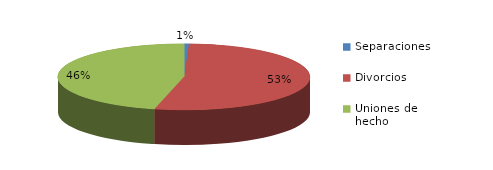
| Category | Series 0 |
|---|---|
| Separaciones | 9 |
| Divorcios | 759 |
| Uniones de hecho | 661 |